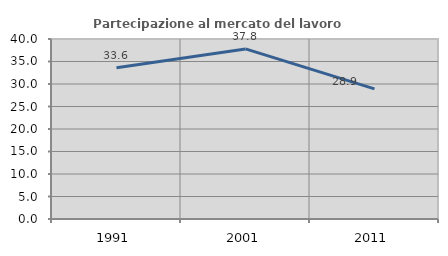
| Category | Partecipazione al mercato del lavoro  femminile |
|---|---|
| 1991.0 | 33.609 |
| 2001.0 | 37.798 |
| 2011.0 | 28.929 |